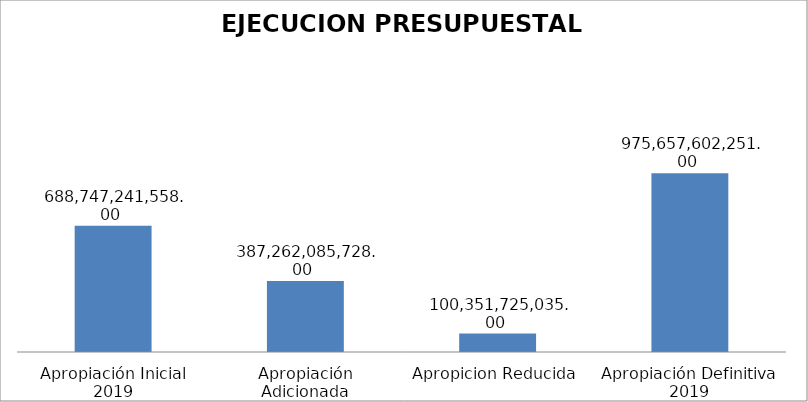
| Category | Series 0 |  688,747,241,558.00  |
|---|---|---|
| Apropiación Inicial 2019 | 688747241558 |  |
| Apropiación Adicionada | 387262085728 |  |
| Apropicion Reducida | 100351725035 |  |
| Apropiación Definitiva 2019 | 975657602251 |  |